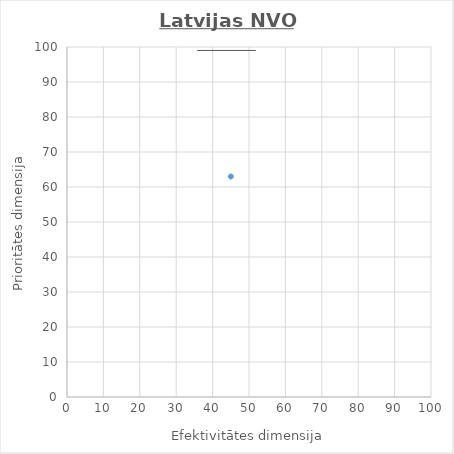
| Category | Series 0 |
|---|---|
| 45.0 | 63 |